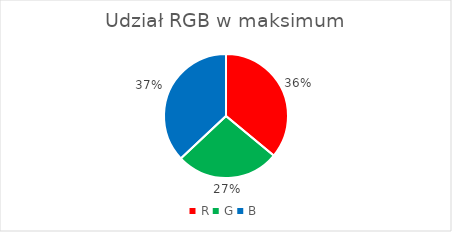
| Category | Series 0 |
|---|---|
| R | 0.36 |
| G | 0.27 |
| B | 0.37 |